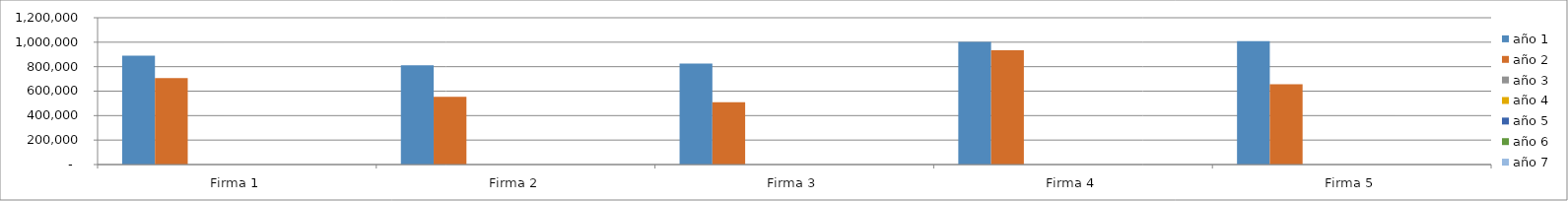
| Category | año 1 | año 2 | año 3 | año 4 | año 5 | año 6 | año 7 |
|---|---|---|---|---|---|---|---|
| Firma 1 | 890450.022 | 707381.085 | 0 | 0 | 0 | 0 | 0 |
| Firma 2 | 812025.331 | 553745.113 | 0 | 0 | 0 | 0 | 0 |
| Firma 3 | 825124.008 | 509789.755 | 0 | 0 | 0 | 0 | 0 |
| Firma 4 | 1001719.655 | 935034.101 | 0 | 0 | 0 | 0 | 0 |
| Firma 5 | 1007894.408 | 656943.693 | 0 | 0 | 0 | 0 | 0 |